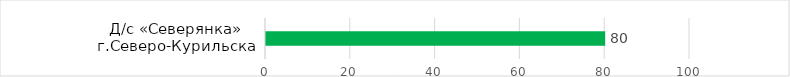
| Category | Series 0 |
|---|---|
| Д/с «Северянка» г.Северо-Курильска | 80 |